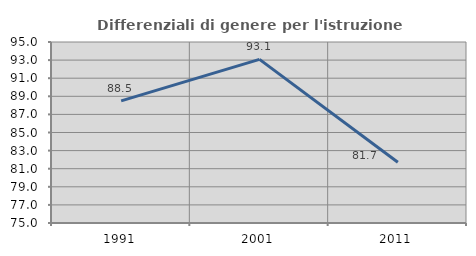
| Category | Differenziali di genere per l'istruzione superiore |
|---|---|
| 1991.0 | 88.497 |
| 2001.0 | 93.076 |
| 2011.0 | 81.709 |